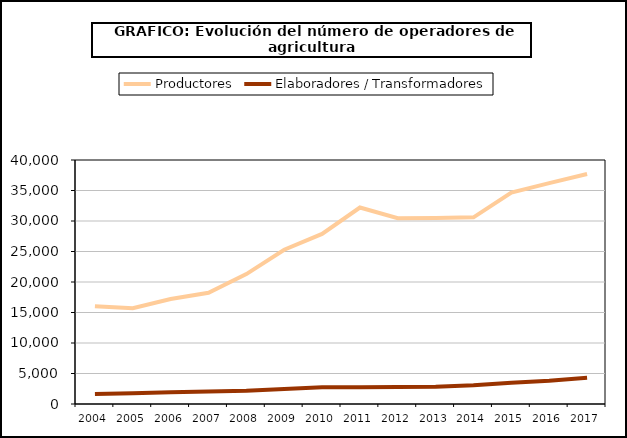
| Category | Productores | Elaboradores / Transformadores |
|---|---|---|
| 2004.0 | 16013 | 1635 |
| 2005.0 | 15693 | 1764 |
| 2006.0 | 17214 | 1942 |
| 2007.0 | 18226 | 2061 |
| 2008.0 | 21291 | 2168 |
| 2009.0 | 25291 | 2465 |
| 2010.0 | 27877 | 2747 |
| 2011.0 | 32206 | 2729 |
| 2012.0 | 30462 | 2790 |
| 2013.0 | 30502 | 2842 |
| 2014.0 | 30602 | 3082 |
| 2015.0 | 34673 | 3492 |
| 2016.0 | 36207 | 3810 |
| 2017.0 | 37712 | 4297 |